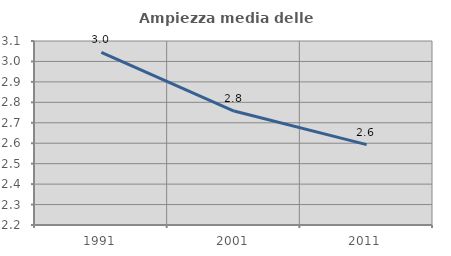
| Category | Ampiezza media delle famiglie |
|---|---|
| 1991.0 | 3.044 |
| 2001.0 | 2.757 |
| 2011.0 | 2.593 |